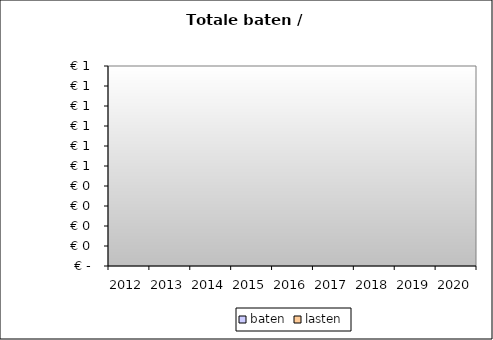
| Category | baten | lasten |
|---|---|---|
| 2012.0 | 0 | 0 |
| 2013.0 | 0 | 0 |
| 2014.0 | 0 | 0 |
| 2015.0 | 0 | 0 |
| 2016.0 | 0 | 0 |
| 2017.0 | 0 | 0 |
| 2018.0 | 0 | 0 |
| 2019.0 | 0 | 0 |
| 2020.0 | 0 | 0 |